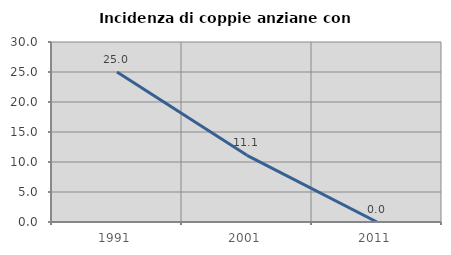
| Category | Incidenza di coppie anziane con figli |
|---|---|
| 1991.0 | 25 |
| 2001.0 | 11.111 |
| 2011.0 | 0 |